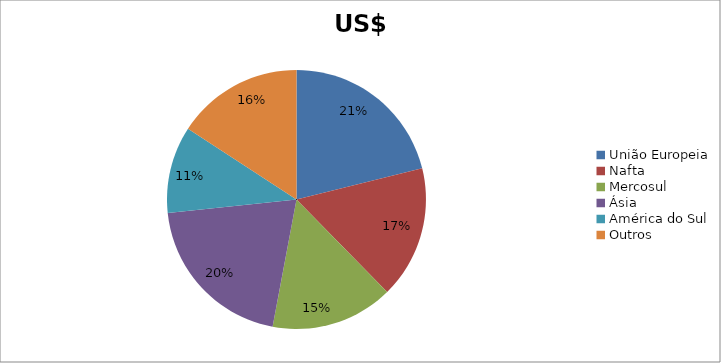
| Category | Series 0 |
|---|---|
| União Europeia | 4015903062 |
| Nafta | 3141789150 |
| Mercosul | 2907735575 |
| Ásia | 3871724692 |
| América do Sul | 2064243267 |
| Outros | 3005052966 |